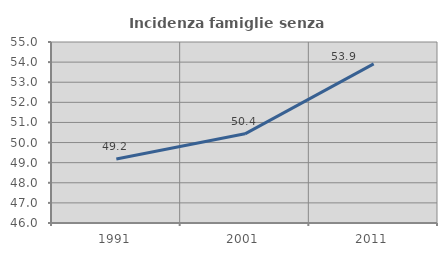
| Category | Incidenza famiglie senza nuclei |
|---|---|
| 1991.0 | 49.18 |
| 2001.0 | 50.435 |
| 2011.0 | 53.913 |